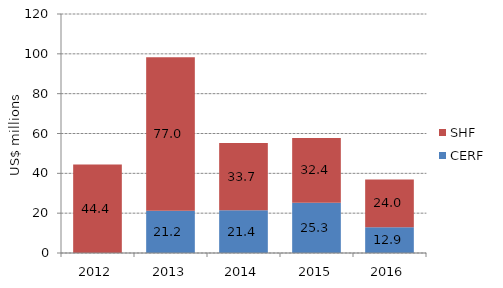
| Category | CERF | SHF |
|---|---|---|
| 2012.0 | 0 | 44.406 |
| 2013.0 | 21.203 | 77.023 |
| 2014.0 | 21.444 | 33.747 |
| 2015.0 | 25.289 | 32.412 |
| 2016.0 | 12.885 | 24 |